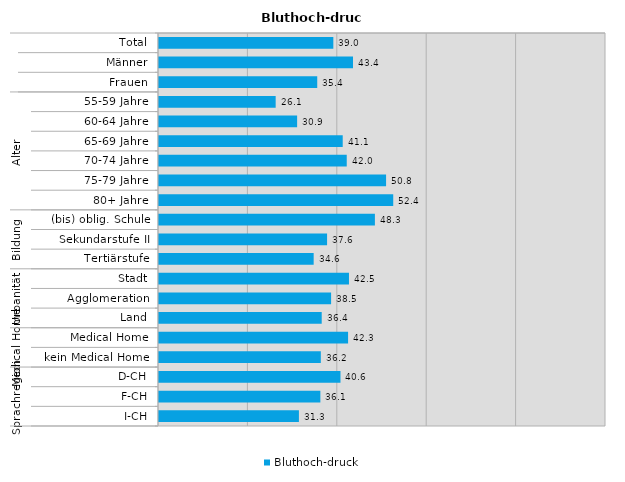
| Category | Bluthoch-druck |
|---|---|
| 0 | 39 |
| 1 | 43.4 |
| 2 | 35.4 |
| 3 | 26.1 |
| 4 | 30.9 |
| 5 | 41.1 |
| 6 | 42 |
| 7 | 50.8 |
| 8 | 52.4 |
| 9 | 48.3 |
| 10 | 37.6 |
| 11 | 34.6 |
| 12 | 42.5 |
| 13 | 38.5 |
| 14 | 36.4 |
| 15 | 42.3 |
| 16 | 36.2 |
| 17 | 40.6 |
| 18 | 36.1 |
| 19 | 31.3 |